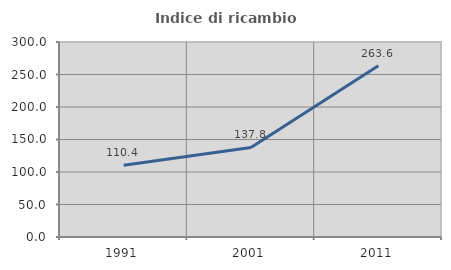
| Category | Indice di ricambio occupazionale  |
|---|---|
| 1991.0 | 110.377 |
| 2001.0 | 137.819 |
| 2011.0 | 263.551 |